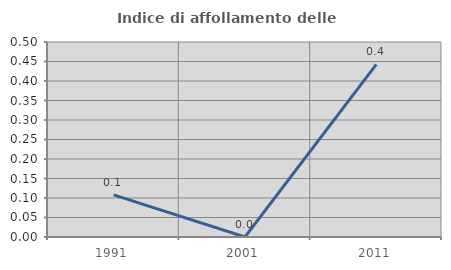
| Category | Indice di affollamento delle abitazioni  |
|---|---|
| 1991.0 | 0.108 |
| 2001.0 | 0 |
| 2011.0 | 0.442 |